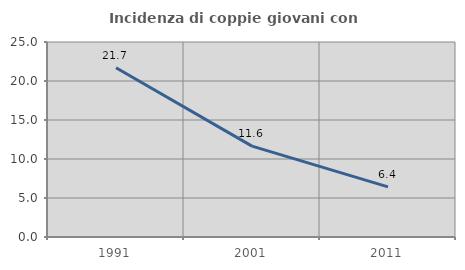
| Category | Incidenza di coppie giovani con figli |
|---|---|
| 1991.0 | 21.69 |
| 2001.0 | 11.646 |
| 2011.0 | 6.427 |